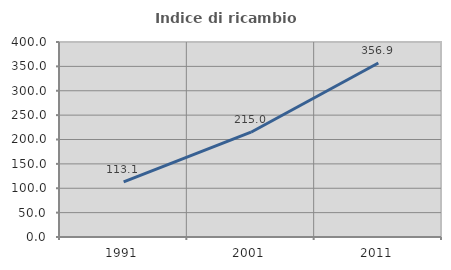
| Category | Indice di ricambio occupazionale  |
|---|---|
| 1991.0 | 113.107 |
| 2001.0 | 214.953 |
| 2011.0 | 356.944 |